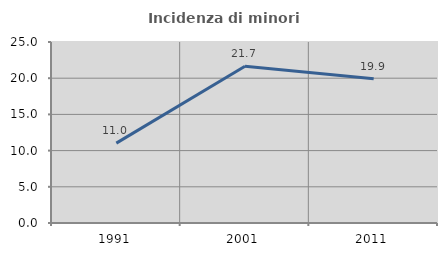
| Category | Incidenza di minori stranieri |
|---|---|
| 1991.0 | 11.029 |
| 2001.0 | 21.651 |
| 2011.0 | 19.911 |